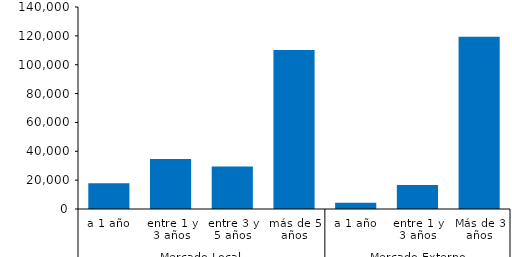
| Category | IV |
|---|---|
| 0 | 17932.171 |
| 1 | 34642.182 |
| 2 | 29472.339 |
| 3 | 110246.46 |
| 4 | 4324.344 |
| 5 | 16573.632 |
| 6 | 119374.485 |